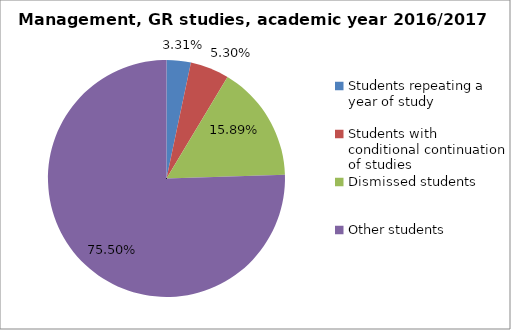
| Category | Series 0 |
|---|---|
| Students repeating a year of study | 10 |
| Students with conditional continuation of studies | 16 |
| Dismissed students | 48 |
| Other students | 228 |